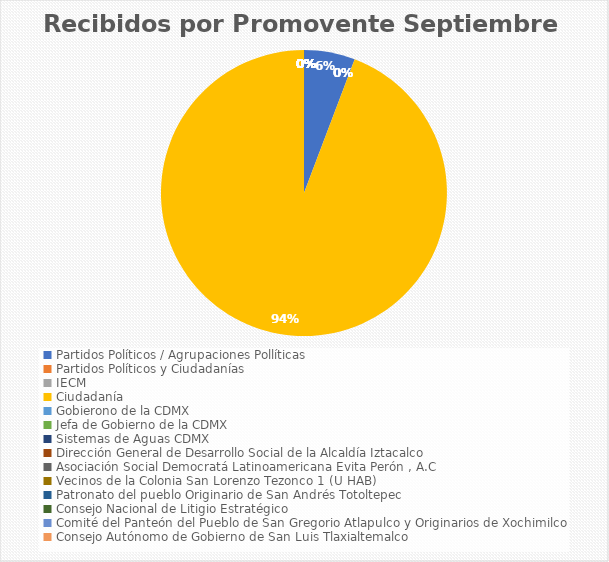
| Category | Recibidos por Promovente Septiembre |
|---|---|
| Partidos Políticos / Agrupaciones Pollíticas | 3 |
| Partidos Políticos y Ciudadanías | 0 |
| IECM | 0 |
| Ciudadanía  | 49 |
| Gobierono de la CDMX | 0 |
| Jefa de Gobierno de la CDMX | 0 |
| Sistemas de Aguas CDMX | 0 |
| Dirección General de Desarrollo Social de la Alcaldía Iztacalco | 0 |
| Asociación Social Democratá Latinoamericana Evita Perón , A.C | 0 |
| Vecinos de la Colonia San Lorenzo Tezonco 1 (U HAB) | 0 |
| Patronato del pueblo Originario de San Andrés Totoltepec | 0 |
| Consejo Nacional de Litigio Estratégico | 0 |
| Comité del Panteón del Pueblo de San Gregorio Atlapulco y Originarios de Xochimilco | 0 |
| Consejo Autónomo de Gobierno de San Luis Tlaxialtemalco | 0 |